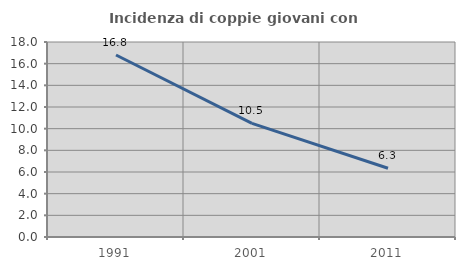
| Category | Incidenza di coppie giovani con figli |
|---|---|
| 1991.0 | 16.801 |
| 2001.0 | 10.49 |
| 2011.0 | 6.343 |